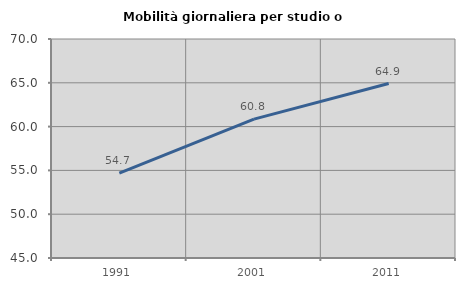
| Category | Mobilità giornaliera per studio o lavoro |
|---|---|
| 1991.0 | 54.684 |
| 2001.0 | 60.85 |
| 2011.0 | 64.918 |